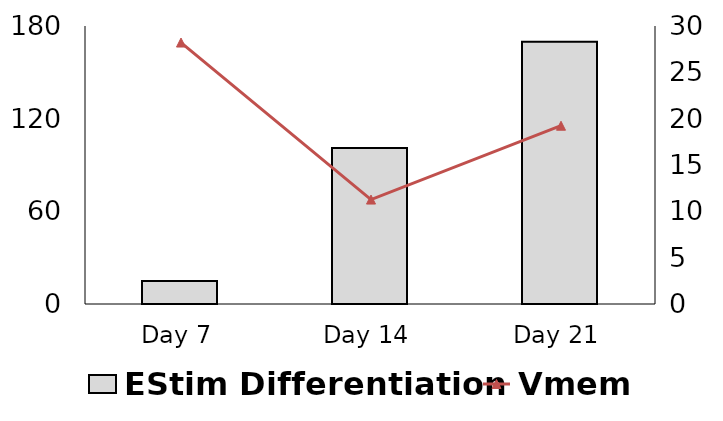
| Category |  EStim Differentiation |
|---|---|
| Day 7 | 14918 |
| Day 14 | 101073.333 |
| Day 21 | 169753 |